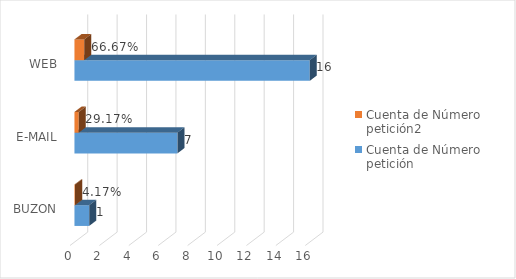
| Category | Cuenta de Número petición | Cuenta de Número petición2 |
|---|---|---|
| BUZON | 1 | 0.042 |
| E-MAIL | 7 | 0.292 |
| WEB | 16 | 0.667 |